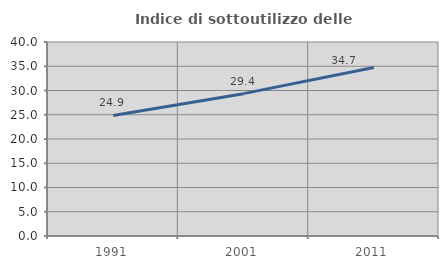
| Category | Indice di sottoutilizzo delle abitazioni  |
|---|---|
| 1991.0 | 24.861 |
| 2001.0 | 29.351 |
| 2011.0 | 34.742 |